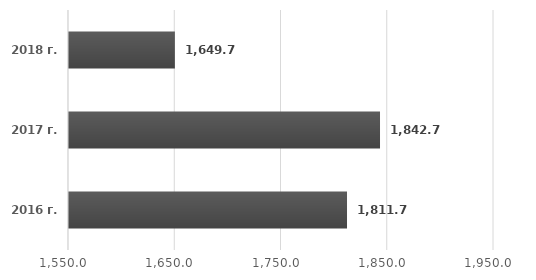
| Category | Series 0 |
|---|---|
| 2016 г. | 1811.66 |
| 2017 г. | 1842.72 |
| 2018 г. | 1649.65 |